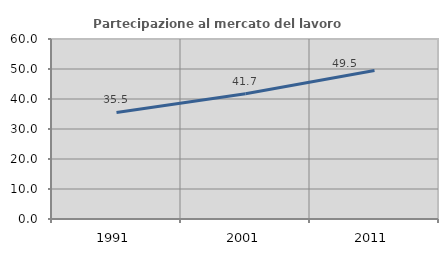
| Category | Partecipazione al mercato del lavoro  femminile |
|---|---|
| 1991.0 | 35.501 |
| 2001.0 | 41.727 |
| 2011.0 | 49.49 |